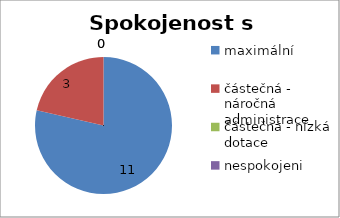
| Category | Spokojenost s dotací |
|---|---|
| maximální | 11 |
| částečná - náročná administrace | 3 |
| částečná - nízká dotace | 0 |
| nespokojeni | 0 |